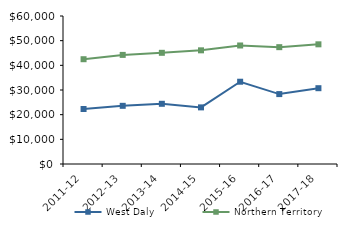
| Category | West Daly | Northern Territory |
|---|---|---|
| 2011-12 | 22290 | 42481 |
| 2012-13 | 23584.21 | 44232.02 |
| 2013-14 | 24406.63 | 45075.51 |
| 2014-15 | 22954.07 | 46083.65 |
| 2015-16 | 33355.46 | 48046.27 |
| 2016-17 | 28341.18 | 47367.05 |
| 2017-18 | 30730.91 | 48519 |